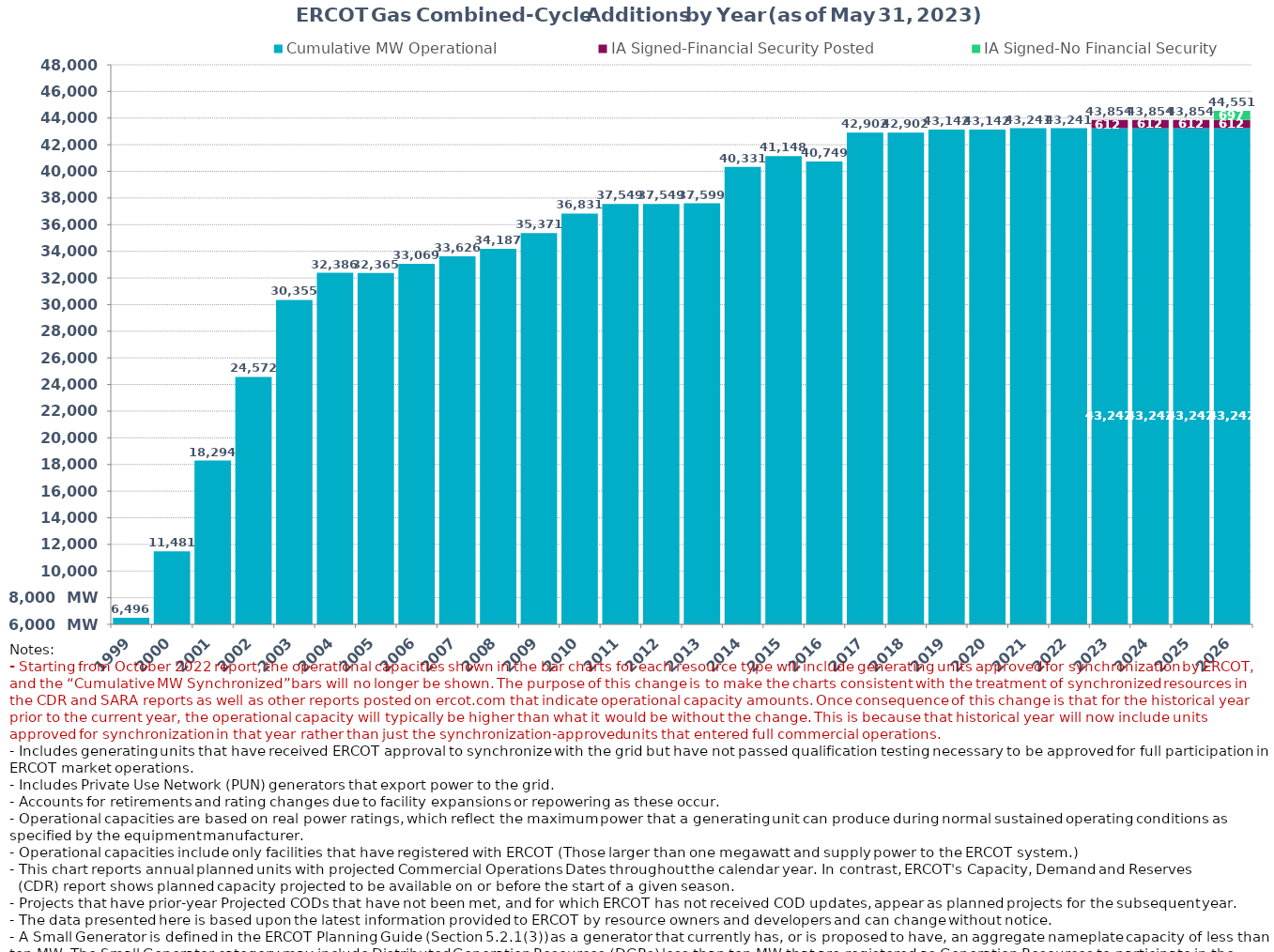
| Category | Cumulative MW Operational  | IA Signed-Financial Security Posted  | IA Signed-No Financial Security  | Small Generator | Cumulative Installed and Planned |
|---|---|---|---|---|---|
| 1999.0 | 6496.189 | 0 | 0 | 0 | 6496.189 |
| 2000.0 | 11480.519 | 0 | 0 | 0 | 11480.519 |
| 2001.0 | 18293.659 | 0 | 0 | 0 | 18293.659 |
| 2002.0 | 24571.899 | 0 | 0 | 0 | 24571.899 |
| 2003.0 | 30354.999 | 0 | 0 | 0 | 30354.999 |
| 2004.0 | 32385.519 | 0 | 0 | 0 | 32385.519 |
| 2005.0 | 32364.619 | 0 | 0 | 0 | 32364.619 |
| 2006.0 | 33068.819 | 0 | 0 | 0 | 33068.819 |
| 2007.0 | 33626.119 | 0 | 0 | 0 | 33626.119 |
| 2008.0 | 34187.219 | 0 | 0 | 0 | 34187.219 |
| 2009.0 | 35370.599 | 0 | 0 | 0 | 35370.599 |
| 2010.0 | 36830.799 | 0 | 0 | 0 | 36830.799 |
| 2011.0 | 37549.199 | 0 | 0 | 0 | 37549.199 |
| 2012.0 | 37549.199 | 0 | 0 | 0 | 37549.199 |
| 2013.0 | 37599.199 | 0 | 0 | 0 | 37599.199 |
| 2014.0 | 40330.999 | 0 | 0 | 0 | 40330.999 |
| 2015.0 | 41148.099 | 0 | 0 | 0 | 41148.099 |
| 2016.0 | 40749.109 | 0 | 0 | 0 | 40749.109 |
| 2017.0 | 42901.609 | 0 | 0 | 0 | 42901.609 |
| 2018.0 | 42901.609 | 0 | 0 | 0 | 42901.609 |
| 2019.0 | 43142.009 | 0 | 0 | 0 | 43142.009 |
| 2020.0 | 43142.009 | 0 | 0 | 0 | 43142.009 |
| 2021.0 | 43240.909 | 0 | 0 | 0 | 43240.909 |
| 2022.0 | 43240.909 | 0 | 0 | 0 | 43240.909 |
| 2023.0 | 43242.209 | 612 | 0 | 0 | 43854.209 |
| 2024.0 | 43242.209 | 612 | 0 | 0 | 43854.209 |
| 2025.0 | 43242.209 | 612 | 0 | 0 | 43854.209 |
| 2026.0 | 43242.209 | 612 | 697 | 0 | 44551.209 |